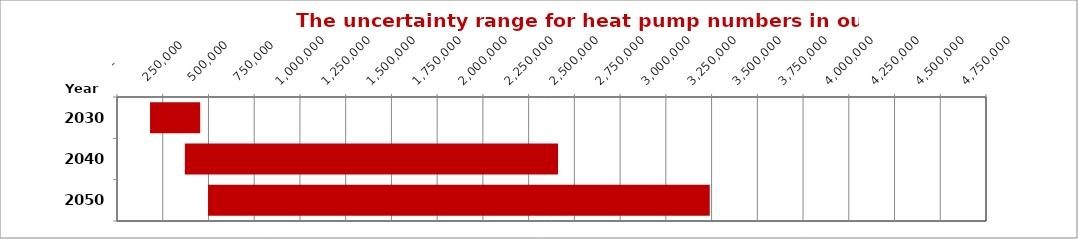
| Category | Min | Inc |
|---|---|---|
| 2030.0 | 180594 | 274320 |
| 2040.0 | 370893 | 2039899 |
| 2050.0 | 497672 | 2742431 |